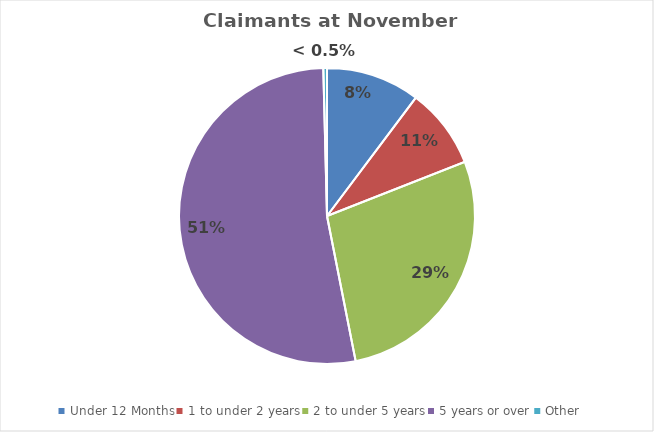
| Category | Series 0 |
|---|---|
| Under 12 Months | 7690 |
| 1 to under 2 years | 6600 |
| 2 to under 5 years | 20900 |
| 5 years or over | 39550 |
| Other | 300 |